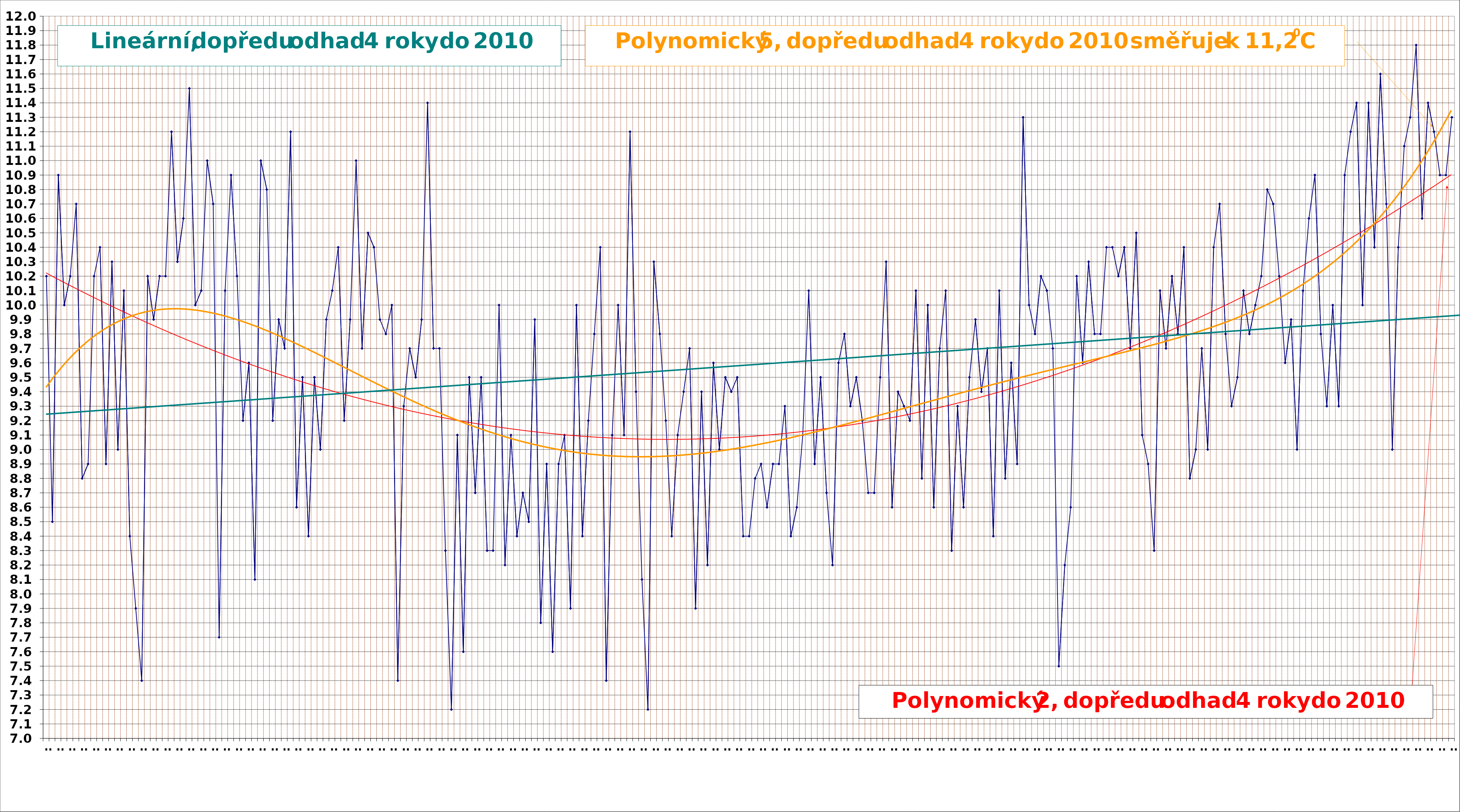
| Category | teplota |
|---|---|
| 1770.0 | 10.2 |
| 1771.0 | 8.5 |
| 1772.0 | 10.9 |
| 1773.0 | 10 |
| 1774.0 | 10.2 |
| 1775.0 | 10.7 |
| 1776.0 | 8.8 |
| 1777.0 | 8.9 |
| 1778.0 | 10.2 |
| 1779.0 | 10.4 |
| 1780.0 | 8.9 |
| 1781.0 | 10.3 |
| 1782.0 | 9 |
| 1783.0 | 10.1 |
| 1784.0 | 8.4 |
| 1785.0 | 7.9 |
| 1786.0 | 7.4 |
| 1787.0 | 10.2 |
| 1788.0 | 9.9 |
| 1789.0 | 10.2 |
| 1790.0 | 10.2 |
| 1791.0 | 11.2 |
| 1792.0 | 10.3 |
| 1793.0 | 10.6 |
| 1794.0 | 11.5 |
| 1795.0 | 10 |
| 1796.0 | 10.1 |
| 1797.0 | 11 |
| 1798.0 | 10.7 |
| 1799.0 | 7.7 |
| 1800.0 | 10.1 |
| 1801.0 | 10.9 |
| 1802.0 | 10.2 |
| 1803.0 | 9.2 |
| 1804.0 | 9.6 |
| 1805.0 | 8.1 |
| 1806.0 | 11 |
| 1807.0 | 10.8 |
| 1808.0 | 9.2 |
| 1809.0 | 9.9 |
| 1810.0 | 9.7 |
| 1811.0 | 11.2 |
| 1812.0 | 8.6 |
| 1813.0 | 9.5 |
| 1814.0 | 8.4 |
| 1815.0 | 9.5 |
| 1816.0 | 9 |
| 1817.0 | 9.9 |
| 1818.0 | 10.1 |
| 1819.0 | 10.4 |
| 1820.0 | 9.2 |
| 1821.0 | 9.9 |
| 1822.0 | 11 |
| 1823.0 | 9.7 |
| 1824.0 | 10.5 |
| 1825.0 | 10.4 |
| 1826.0 | 9.9 |
| 1827.0 | 9.8 |
| 1828.0 | 10 |
| 1829.0 | 7.4 |
| 1830.0 | 9.3 |
| 1831.0 | 9.7 |
| 1832.0 | 9.5 |
| 1833.0 | 9.9 |
| 1834.0 | 11.4 |
| 1835.0 | 9.7 |
| 1836.0 | 9.7 |
| 1837.0 | 8.3 |
| 1838.0 | 7.2 |
| 1839.0 | 9.1 |
| 1840.0 | 7.6 |
| 1841.0 | 9.5 |
| 1842.0 | 8.7 |
| 1843.0 | 9.5 |
| 1844.0 | 8.3 |
| 1845.0 | 8.3 |
| 1846.0 | 10 |
| 1847.0 | 8.2 |
| 1848.0 | 9.1 |
| 1849.0 | 8.4 |
| 1850.0 | 8.7 |
| 1851.0 | 8.5 |
| 1852.0 | 9.9 |
| 1853.0 | 7.8 |
| 1854.0 | 8.9 |
| 1855.0 | 7.6 |
| 1856.0 | 8.9 |
| 1857.0 | 9.1 |
| 1858.0 | 7.9 |
| 1859.0 | 10 |
| 1860.0 | 8.4 |
| 1861.0 | 9.2 |
| 1862.0 | 9.8 |
| 1863.0 | 10.4 |
| 1864.0 | 7.4 |
| 1865.0 | 9.1 |
| 1866.0 | 10 |
| 1867.0 | 9.1 |
| 1868.0 | 11.2 |
| 1869.0 | 9.4 |
| 1870.0 | 8.1 |
| 1871.0 | 7.2 |
| 1872.0 | 10.3 |
| 1873.0 | 9.8 |
| 1874.0 | 9.2 |
| 1875.0 | 8.4 |
| 1876.0 | 9.1 |
| 1877.0 | 9.4 |
| 1878.0 | 9.7 |
| 1879.0 | 7.9 |
| 1880.0 | 9.4 |
| 1881.0 | 8.2 |
| 1882.0 | 9.6 |
| 1883.0 | 9 |
| 1884.0 | 9.5 |
| 1885.0 | 9.4 |
| 1886.0 | 9.5 |
| 1887.0 | 8.4 |
| 1888.0 | 8.4 |
| 1889.0 | 8.8 |
| 1890.0 | 8.9 |
| 1891.0 | 8.6 |
| 1892.0 | 8.9 |
| 1893.0 | 8.9 |
| 1894.0 | 9.3 |
| 1895.0 | 8.4 |
| 1896.0 | 8.6 |
| 1897.0 | 9.1 |
| 1898.0 | 10.1 |
| 1899.0 | 8.9 |
| 1900.0 | 9.5 |
| 1901.0 | 8.7 |
| 1902.0 | 8.2 |
| 1903.0 | 9.6 |
| 1904.0 | 9.8 |
| 1905.0 | 9.3 |
| 1906.0 | 9.5 |
| 1907.0 | 9.2 |
| 1908.0 | 8.7 |
| 1909.0 | 8.7 |
| 1910.0 | 9.5 |
| 1911.0 | 10.3 |
| 1912.0 | 8.6 |
| 1913.0 | 9.4 |
| 1914.0 | 9.3 |
| 1915.0 | 9.2 |
| 1916.0 | 10.1 |
| 1917.0 | 8.8 |
| 1918.0 | 10 |
| 1919.0 | 8.6 |
| 1920.0 | 9.7 |
| 1921.0 | 10.1 |
| 1922.0 | 8.3 |
| 1923.0 | 9.3 |
| 1924.0 | 8.6 |
| 1925.0 | 9.5 |
| 1926.0 | 9.9 |
| 1927.0 | 9.4 |
| 1928.0 | 9.7 |
| 1929.0 | 8.4 |
| 1930.0 | 10.1 |
| 1931.0 | 8.8 |
| 1932.0 | 9.6 |
| 1933.0 | 8.9 |
| 1934.0 | 11.3 |
| 1935.0 | 10 |
| 1936.0 | 9.8 |
| 1937.0 | 10.2 |
| 1938.0 | 10.1 |
| 1939.0 | 9.7 |
| 1940.0 | 7.5 |
| 1941.0 | 8.2 |
| 1942.0 | 8.6 |
| 1943.0 | 10.2 |
| 1944.0 | 9.6 |
| 1945.0 | 10.3 |
| 1946.0 | 9.8 |
| 1947.0 | 9.8 |
| 1948.0 | 10.4 |
| 1949.0 | 10.4 |
| 1950.0 | 10.2 |
| 1951.0 | 10.4 |
| 1952.0 | 9.7 |
| 1953.0 | 10.5 |
| 1954.0 | 9.1 |
| 1955.0 | 8.9 |
| 1956.0 | 8.3 |
| 1957.0 | 10.1 |
| 1958.0 | 9.7 |
| 1959.0 | 10.2 |
| 1960.0 | 9.8 |
| 1961.0 | 10.4 |
| 1962.0 | 8.8 |
| 1963.0 | 9 |
| 1964.0 | 9.7 |
| 1965.0 | 9 |
| 1966.0 | 10.4 |
| 1967.0 | 10.7 |
| 1968.0 | 9.8 |
| 1969.0 | 9.3 |
| 1970.0 | 9.5 |
| 1971.0 | 10.1 |
| 1972.0 | 9.8 |
| 1973.0 | 10 |
| 1974.0 | 10.2 |
| 1975.0 | 10.8 |
| 1976.0 | 10.7 |
| 1977.0 | 10.2 |
| 1978.0 | 9.6 |
| 1979.0 | 9.9 |
| 1980.0 | 9 |
| 1981.0 | 10.1 |
| 1982.0 | 10.6 |
| 1983.0 | 10.9 |
| 1984.0 | 9.8 |
| 1985.0 | 9.3 |
| 1986.0 | 10 |
| 1987.0 | 9.3 |
| 1988.0 | 10.9 |
| 1989.0 | 11.2 |
| 1990.0 | 11.4 |
| 1991.0 | 10 |
| 1992.0 | 11.4 |
| 1993.0 | 10.4 |
| 1994.0 | 11.6 |
| 1995.0 | 10.7 |
| 1996.0 | 9 |
| 1997.0 | 10.4 |
| 1998.0 | 11.1 |
| 1999.0 | 11.3 |
| 2000.0 | 11.8 |
| 2001.0 | 10.6 |
| 2002.0 | 11.4 |
| 2003.0 | 11.2 |
| 2004.0 | 10.9 |
| 2005.0 | 10.9 |
| 2006.0 | 11.3 |